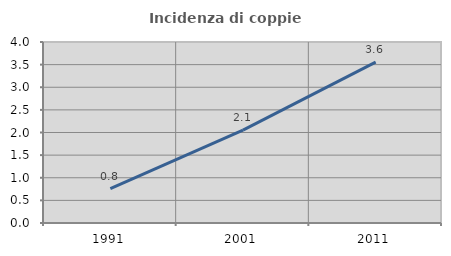
| Category | Incidenza di coppie miste |
|---|---|
| 1991.0 | 0.758 |
| 2001.0 | 2.052 |
| 2011.0 | 3.557 |